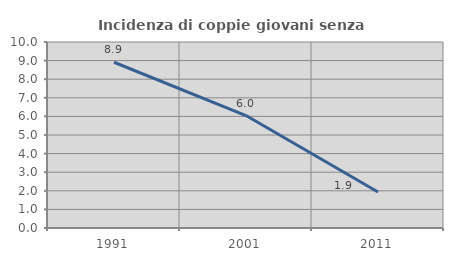
| Category | Incidenza di coppie giovani senza figli |
|---|---|
| 1991.0 | 8.911 |
| 2001.0 | 6.047 |
| 2011.0 | 1.932 |